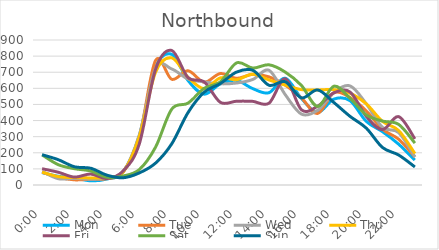
| Category | Mon | Tue | Wed | Thu | Fri | Sat | Sun |
|---|---|---|---|---|---|---|---|
| 0.0 | 77 | 79 | 84 | 80 | 101 | 187 | 188 |
| 0.041667 | 54 | 48 | 39 | 52 | 79 | 126 | 157 |
| 0.083333 | 44 | 32 | 41 | 46 | 49 | 101 | 113 |
| 0.125 | 26 | 36 | 36 | 44 | 68 | 87 | 104 |
| 0.166667 | 37 | 39 | 43 | 46 | 40 | 48 | 61 |
| 0.208333 | 81 | 80 | 83 | 81 | 87 | 56 | 45 |
| 0.25 | 307 | 298 | 312 | 302 | 256 | 96 | 75 |
| 0.291667 | 729 | 773 | 724 | 700 | 718 | 235 | 136 |
| 0.333333 | 811 | 656 | 720 | 789 | 835 | 471 | 256 |
| 0.375 | 649 | 709 | 658 | 669 | 667 | 508 | 449 |
| 0.416667 | 564 | 638 | 640 | 598 | 640 | 600 | 576 |
| 0.458333 | 628 | 692 | 628 | 665 | 513 | 640 | 630 |
| 0.5 | 649 | 662 | 633 | 653 | 520 | 758 | 701 |
| 0.541667 | 598 | 687 | 655 | 688 | 519 | 726 | 712 |
| 0.5833333333333334 | 573 | 671 | 712 | 652 | 508 | 746 | 619 |
| 0.625 | 663 | 620 | 561 | 620 | 659 | 701 | 641 |
| 0.666667 | 537 | 540 | 440 | 592 | 467 | 618 | 541 |
| 0.708333 | 450 | 444 | 464 | 590 | 489 | 488 | 590 |
| 0.75 | 533 | 573 | 573 | 592 | 572 | 613 | 512 |
| 0.791667 | 523 | 543 | 615 | 570 | 577 | 538 | 426 |
| 0.833333 | 395 | 460 | 504 | 504 | 426 | 435 | 353 |
| 0.875 | 331 | 346 | 358 | 395 | 344 | 397 | 233 |
| 0.916667 | 253 | 284 | 325 | 338 | 424 | 376 | 186 |
| 0.958333 | 155 | 174 | 174 | 195 | 286 | 260 | 112 |